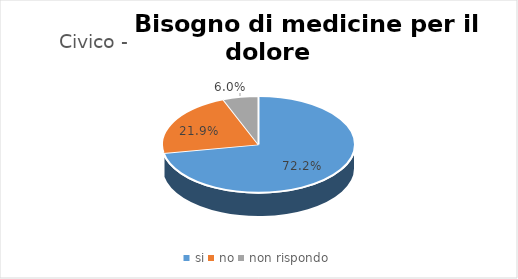
| Category | Civico - Osp -  Palermo - PA |
|---|---|
| si | 0.722 |
| no | 0.219 |
| non rispondo | 0.06 |